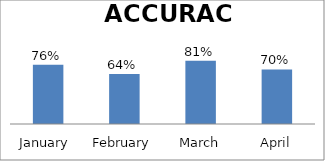
| Category | ACCURACY |
|---|---|
| January  | 0.76 |
| February | 0.64 |
| March | 0.81 |
| April | 0.7 |